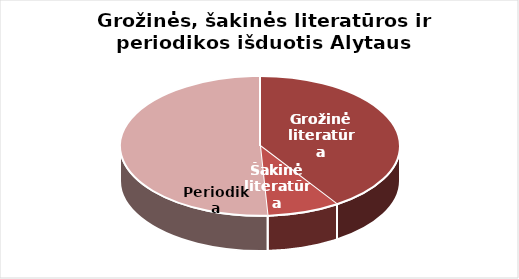
| Category | Series 0 |
|---|---|
| Grožinė literatūra | 502644 |
| Šakinė literatūra | 103671 |
| Periodika | 627527 |